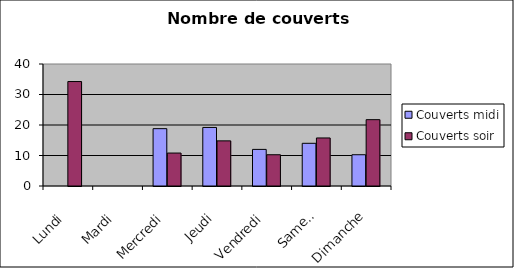
| Category | Couverts |
|---|---|
| Lundi | 34.25 |
| Mardi | 0 |
| Mercredi | 10.8 |
| Jeudi | 14.8 |
| Vendredi | 10.25 |
| Samedi | 15.75 |
| Dimanche | 21.75 |